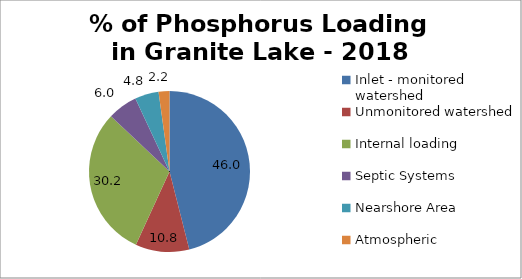
| Category | Series 0 |
|---|---|
| Inlet - monitored watershed | 46.048 |
| Unmonitored watershed | 10.808 |
| Internal loading  | 30.179 |
| Septic Systems | 5.998 |
| Nearshore Area | 4.793 |
| Atmospheric | 2.175 |